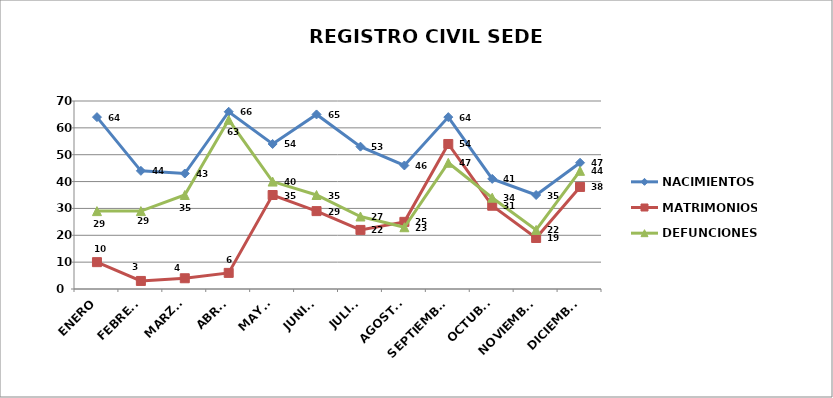
| Category | NACIMIENTOS | MATRIMONIOS | DEFUNCIONES |
|---|---|---|---|
| ENERO | 64 | 10 | 29 |
| FEBRERO | 44 | 3 | 29 |
| MARZO | 43 | 4 | 35 |
| ABRIL | 66 | 6 | 63 |
| MAYO | 54 | 35 | 40 |
| JUNIO | 65 | 29 | 35 |
| JULIO | 53 | 22 | 27 |
| AGOSTO | 46 | 25 | 23 |
| SEPTIEMBRE | 64 | 54 | 47 |
| OCTUBRE | 41 | 31 | 34 |
| NOVIEMBRE | 35 | 19 | 22 |
| DICIEMBRE | 47 | 38 | 44 |